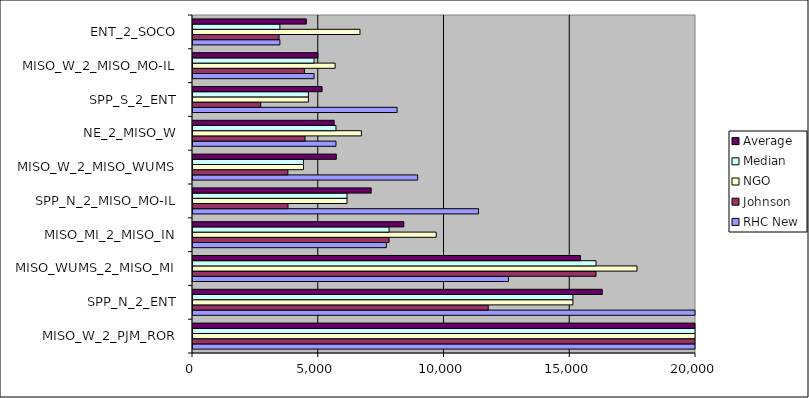
| Category | RHC New | Johnson | NGO | Median | Average |
|---|---|---|---|---|---|
| MISO_W_2_PJM_ROR | 39914.842 | 23477.094 | 30870.55 | 30870.55 | 31420.829 |
| SPP_N_2_ENT | 21973.3 | 11737.949 | 15105.53 | 15105.53 | 16272.26 |
| MISO_WUMS_2_MISO_MI | 12542.414 | 16024.206 | 17654.21 | 16024.206 | 15406.943 |
| MISO_MI_2_MISO_IN | 7687.32 | 7795.91 | 9670.57 | 7795.91 | 8384.6 |
| SPP_N_2_MISO_MO-IL | 11353.361 | 3775.783 | 6123.8 | 6123.8 | 7084.315 |
| MISO_W_2_MISO_WUMS | 8932.201 | 3771.348 | 4392.1 | 4392.1 | 5698.55 |
| NE_2_MISO_W | 5685.067 | 4454.537 | 6695.65 | 5685.067 | 5611.751 |
| SPP_S_2_ENT | 8115.306 | 2692.541 | 4588.71 | 4588.71 | 5132.186 |
| MISO_W_2_MISO_MO-IL | 4813.037 | 4428.617 | 5651.29 | 4813.037 | 4964.315 |
| ENT_2_SOCO | 3454.911 | 3421.339 | 6639.87 | 3454.911 | 4505.373 |